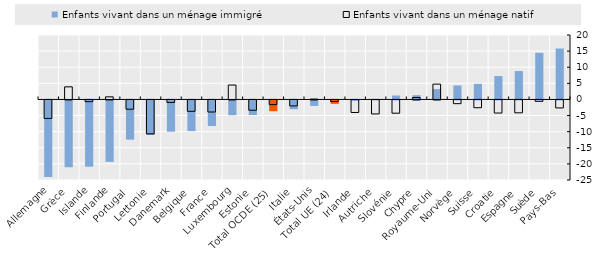
| Category | Enfants vivant dans un ménage immigré | Enfants vivant dans un ménage natif |
|---|---|---|
| Allemagne | -23.758 | -5.732 |
| Grèce | -20.724 | 3.907 |
| Islande | -20.574 | -0.534 |
| Finlande | -19.068 | 0.809 |
| Portugal | -12.167 | -2.88 |
| Lettonie | -10.711 | -10.526 |
| Danemark | -9.699 | -0.777 |
| Belgique | -9.519 | -3.525 |
| France | -7.925 | -3.745 |
| Luxembourg | -4.595 | 4.473 |
| Estonie | -4.515 | -3.199 |
| Total OCDE (25) | -3.338 | -1.457 |
| Italie | -2.729 | -1.856 |
| États-Unis | -1.71 | 0.11 |
| Total UE (24) | -1.055 | -0.474 |
| Irlande | -0.19 | -3.888 |
| Autriche | 0.04 | -4.347 |
| Slovénie | 1.215 | -4.113 |
| Chypre | 1.331 | 0.603 |
| Royaume-Uni | 3.208 | 4.758 |
| Norvège | 4.331 | -1.152 |
| Suisse | 4.851 | -2.413 |
| Croatie | 7.26 | -4.063 |
| Espagne | 8.812 | -3.994 |
| Suède | 14.491 | -0.429 |
| Pays-Bas | 15.803 | -2.476 |